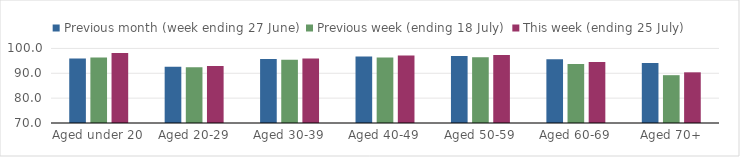
| Category | Previous month (week ending 27 June) | Previous week (ending 18 July) | This week (ending 25 July) |
|---|---|---|---|
| Aged under 20 | 95.924 | 96.338 | 98.163 |
| Aged 20-29 | 92.669 | 92.478 | 92.955 |
| Aged 30-39 | 95.794 | 95.485 | 95.99 |
| Aged 40-49 | 96.783 | 96.365 | 97.174 |
| Aged 50-59 | 96.951 | 96.439 | 97.381 |
| Aged 60-69 | 95.624 | 93.711 | 94.569 |
| Aged 70+ | 94.142 | 89.238 | 90.388 |